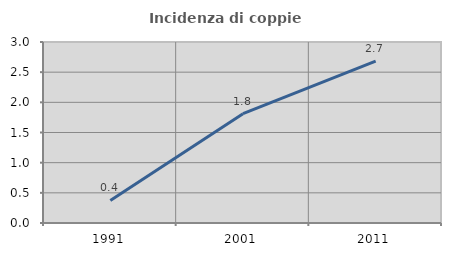
| Category | Incidenza di coppie miste |
|---|---|
| 1991.0 | 0.374 |
| 2001.0 | 1.813 |
| 2011.0 | 2.683 |